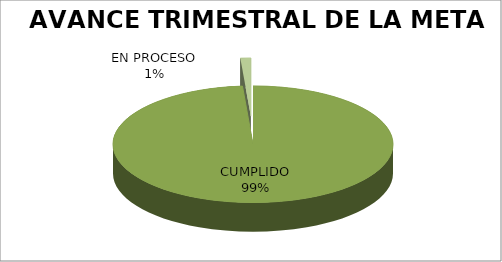
| Category | AVANCE TRIMESTRAL DE LA META |
|---|---|
| CUMPLIDO | 247 |
| EN PROCESO | 3 |